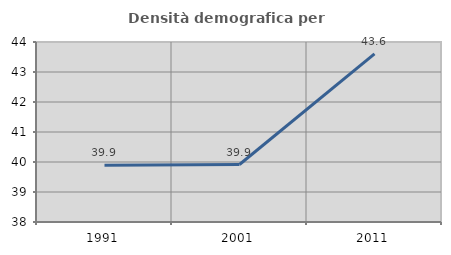
| Category | Densità demografica |
|---|---|
| 1991.0 | 39.894 |
| 2001.0 | 39.916 |
| 2011.0 | 43.607 |